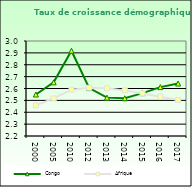
| Category | Congo | Afrique                        |
|---|---|---|
| 2000.0 | 2.549 | 2.458 |
| 2005.0 | 2.652 | 2.516 |
| 2010.0 | 2.918 | 2.59 |
| 2012.0 | 2.603 | 2.606 |
| 2013.0 | 2.523 | 2.601 |
| 2014.0 | 2.518 | 2.584 |
| 2015.0 | 2.561 | 2.559 |
| 2016.0 | 2.612 | 2.531 |
| 2017.0 | 2.642 | 2.503 |